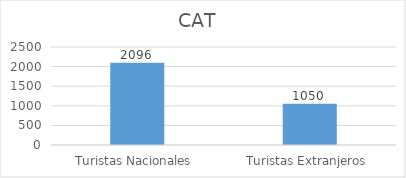
| Category | Total Genral  |
|---|---|
| Turistas Nacionales  | 2096 |
| Turistas Extranjeros  | 1050 |